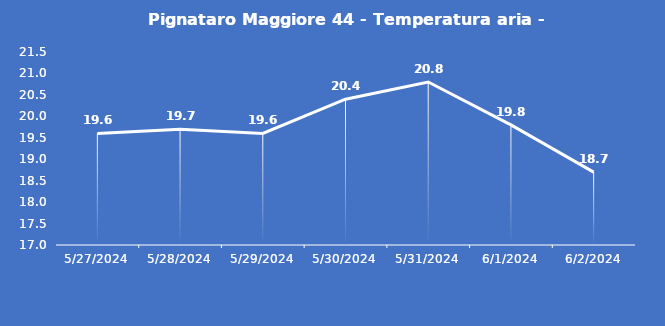
| Category | Pignataro Maggiore 44 - Temperatura aria - Grezzo (°C) |
|---|---|
| 5/27/24 | 19.6 |
| 5/28/24 | 19.7 |
| 5/29/24 | 19.6 |
| 5/30/24 | 20.4 |
| 5/31/24 | 20.8 |
| 6/1/24 | 19.8 |
| 6/2/24 | 18.7 |